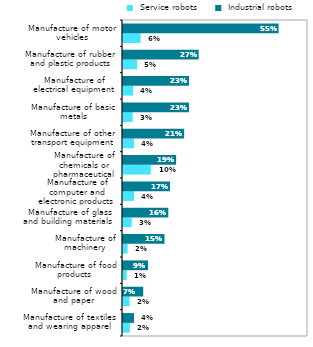
| Category |  Service robots |  Industrial robots |
|---|---|---|
| Manufacture of textiles and wearing apparel | 0.024 | 0.039 |
| Manufacture of wood and paper | 0.023 | 0.071 |
| Manufacture of food products | 0.013 | 0.088 |
| Manufacture of machinery | 0.016 | 0.146 |
| Manufacture of glass and building materials  | 0.031 | 0.159 |
| Manufacture of computer and electronic products | 0.039 | 0.165 |
| Manufacture of chemicals or pharmaceutical products | 0.098 | 0.187 |
| Manufacture of other transport equipment | 0.039 | 0.215 |
| Manufacture of basic metals | 0.034 | 0.232 |
| Manufacture of electrical equipment | 0.035 | 0.232 |
| Manufacture of rubber and plastic products | 0.049 | 0.266 |
| Manufacture of motor vehicles | 0.062 | 0.547 |